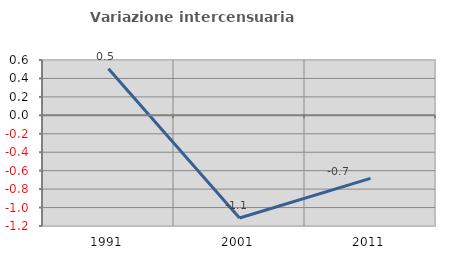
| Category | Variazione intercensuaria annua |
|---|---|
| 1991.0 | 0.504 |
| 2001.0 | -1.113 |
| 2011.0 | -0.684 |